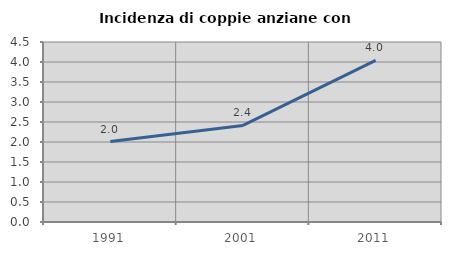
| Category | Incidenza di coppie anziane con figli |
|---|---|
| 1991.0 | 2.011 |
| 2001.0 | 2.414 |
| 2011.0 | 4.04 |